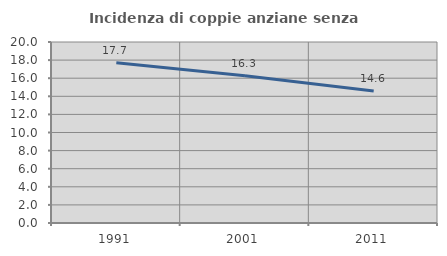
| Category | Incidenza di coppie anziane senza figli  |
|---|---|
| 1991.0 | 17.711 |
| 2001.0 | 16.279 |
| 2011.0 | 14.583 |